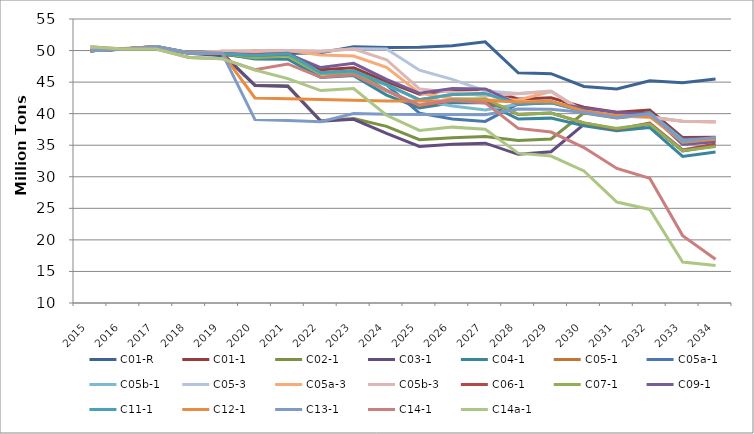
| Category | C01-R | C01-1 | C02-1 | C03-1 | C04-1 | C05-1 | C05a-1 | C05b-1 | C05-3 | C05a-3 | C05b-3 | C06-1 | C07-1 | C09-1 | C11-1 | C12-1 | C13-1 | C14-1 | C14a-1 |
|---|---|---|---|---|---|---|---|---|---|---|---|---|---|---|---|---|---|---|---|
| 2015.0 | 50.118 | 49.98 | 49.98 | 49.98 | 49.98 | 49.98 | 49.98 | 49.98 | 50.119 | 50.118 | 50.118 | 49.98 | 49.98 | 49.973 | 49.98 | 49.98 | 49.98 | 50.61 | 50.551 |
| 2016.0 | 50.329 | 50.239 | 50.239 | 50.239 | 50.239 | 50.239 | 50.239 | 50.239 | 50.239 | 50.238 | 50.239 | 50.239 | 50.239 | 50.225 | 50.228 | 50.238 | 50.238 | 50.244 | 50.242 |
| 2017.0 | 50.499 | 50.623 | 50.623 | 50.593 | 50.593 | 50.623 | 50.623 | 50.623 | 50.623 | 50.622 | 50.623 | 50.591 | 50.59 | 50.6 | 50.598 | 50.623 | 50.622 | 50.252 | 50.249 |
| 2018.0 | 49.555 | 49.637 | 49.621 | 49.56 | 49.56 | 49.637 | 49.62 | 49.638 | 49.556 | 49.552 | 49.556 | 49.579 | 49.579 | 49.612 | 49.601 | 49.62 | 49.62 | 48.913 | 48.91 |
| 2019.0 | 49.181 | 49.422 | 49.588 | 49.523 | 49.52 | 49.593 | 49.588 | 49.592 | 49.9 | 49.894 | 49.9 | 49.527 | 49.527 | 49.523 | 49.528 | 49.588 | 49.587 | 48.713 | 48.71 |
| 2020.0 | 49.976 | 48.827 | 44.548 | 44.474 | 48.68 | 49.264 | 49.391 | 49.394 | 49.922 | 49.913 | 49.924 | 49.351 | 48.841 | 49.201 | 49.225 | 42.494 | 39.059 | 46.973 | 46.925 |
| 2021.0 | 49.548 | 49.578 | 44.409 | 44.323 | 48.615 | 49.503 | 49.52 | 49.521 | 50.013 | 50.013 | 50.013 | 49.573 | 49.123 | 49.462 | 49.533 | 42.376 | 38.904 | 47.874 | 45.562 |
| 2022.0 | 49.671 | 46.971 | 38.892 | 38.806 | 45.75 | 46.458 | 46.454 | 46.454 | 49.872 | 49.312 | 49.871 | 46.456 | 46.271 | 47.309 | 46.477 | 42.259 | 38.734 | 45.766 | 43.657 |
| 2023.0 | 50.618 | 47.262 | 39.227 | 39.113 | 46.031 | 46.735 | 46.336 | 46.739 | 50.303 | 49.132 | 50.242 | 46.771 | 46.54 | 47.971 | 46.76 | 42.141 | 40.027 | 46.167 | 43.979 |
| 2024.0 | 50.491 | 45.086 | 37.989 | 36.873 | 42.949 | 44.62 | 44.578 | 44.577 | 50.252 | 47.347 | 48.546 | 43.672 | 43.716 | 45.437 | 44.651 | 42.024 | 39.892 | 43.611 | 39.744 |
| 2025.0 | 50.508 | 43.063 | 35.886 | 34.801 | 40.898 | 42.192 | 40.083 | 42.148 | 46.893 | 43.259 | 43.912 | 41.228 | 41.314 | 43.229 | 42.198 | 42.024 | 39.884 | 41.372 | 37.344 |
| 2026.0 | 50.777 | 43.764 | 36.166 | 35.167 | 41.72 | 43.033 | 39.163 | 41.219 | 45.442 | 42.413 | 43.392 | 42.098 | 42.293 | 43.979 | 43.027 | 42.053 | 39.874 | 42.121 | 37.867 |
| 2027.0 | 51.38 | 43.847 | 36.385 | 35.328 | 41.761 | 43.224 | 38.769 | 40.597 | 43.605 | 42.177 | 42.809 | 42.183 | 42.373 | 43.917 | 43.169 | 42.083 | 39.824 | 41.708 | 37.519 |
| 2028.0 | 46.481 | 42.329 | 35.758 | 33.555 | 39.147 | 41.552 | 41.541 | 41.477 | 43.189 | 42.179 | 43.171 | 39.853 | 39.911 | 41.487 | 41.56 | 41.836 | 40.729 | 37.668 | 33.743 |
| 2029.0 | 46.342 | 42.511 | 35.988 | 33.965 | 39.293 | 41.792 | 41.829 | 41.738 | 43.594 | 43.503 | 43.52 | 40.093 | 40.093 | 41.717 | 41.78 | 41.972 | 40.7 | 37.087 | 33.283 |
| 2030.0 | 44.317 | 41.021 | 40.114 | 38.317 | 38.08 | 40.363 | 40.405 | 40.374 | 40.299 | 40.272 | 40.299 | 38.529 | 38.541 | 40.844 | 40.322 | 40.416 | 40.174 | 34.622 | 30.925 |
| 2031.0 | 43.901 | 40.228 | 39.328 | 37.368 | 37.281 | 39.493 | 39.498 | 39.496 | 39.646 | 39.619 | 39.643 | 37.553 | 37.672 | 40.197 | 39.47 | 39.69 | 39.346 | 31.324 | 25.998 |
| 2032.0 | 45.215 | 40.585 | 39.865 | 38.301 | 37.79 | 40.079 | 40.178 | 40.087 | 39.467 | 39.44 | 39.475 | 38.492 | 38.355 | 39.962 | 40.034 | 39.528 | 39.98 | 29.775 | 24.826 |
| 2033.0 | 44.915 | 36.207 | 35.583 | 34.11 | 33.218 | 35.783 | 35.941 | 35.786 | 38.804 | 38.785 | 38.801 | 34.247 | 34.132 | 35.121 | 35.422 | 35.517 | 35.681 | 20.677 | 16.499 |
| 2034.0 | 45.496 | 36.272 | 35.746 | 34.899 | 33.931 | 35.943 | 36.103 | 35.965 | 38.707 | 38.699 | 38.705 | 35.214 | 34.805 | 35.55 | 36.071 | 35.937 | 36.212 | 16.924 | 15.945 |